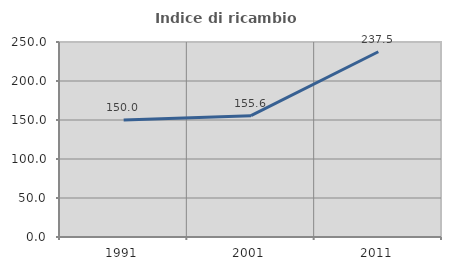
| Category | Indice di ricambio occupazionale  |
|---|---|
| 1991.0 | 150 |
| 2001.0 | 155.556 |
| 2011.0 | 237.5 |